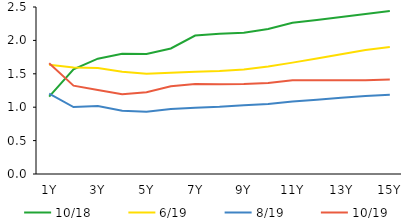
| Category | 10/18 | 6/19 | 8/19 | 10/19 |
|---|---|---|---|---|
|  1Y | 1.159 | 1.637 | 1.203 | 1.656 |
|  2Y | 1.569 | 1.595 | 1.003 | 1.322 |
|  3Y | 1.727 | 1.587 | 1.018 | 1.257 |
|  4Y | 1.801 | 1.531 | 0.946 | 1.195 |
|  5Y | 1.796 | 1.499 | 0.931 | 1.224 |
|  6Y | 1.88 | 1.516 | 0.972 | 1.314 |
|  7Y | 2.073 | 1.529 | 0.993 | 1.348 |
|  8Y | 2.101 | 1.543 | 1.006 | 1.342 |
|  9Y | 2.116 | 1.565 | 1.03 | 1.347 |
|  10Y | 2.171 | 1.611 | 1.046 | 1.363 |
|  11Y | 2.264 | 1.667 | 1.086 | 1.402 |
|  12Y | 2.307 | 1.731 | 1.113 | 1.402 |
|  13Y | 2.351 | 1.794 | 1.14 | 1.403 |
|  14Y | 2.395 | 1.857 | 1.167 | 1.404 |
|  15Y | 2.44 | 1.902 | 1.187 | 1.415 |